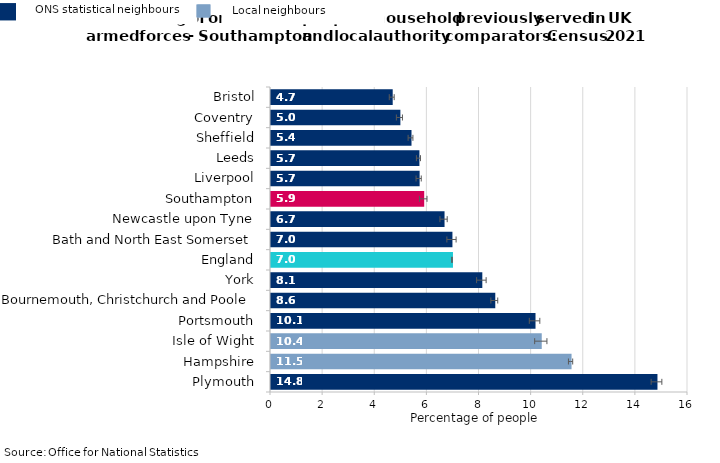
| Category | 1 or more people in the household previously served in UK armed forces |
|---|---|
| Plymouth | 14.828 |
| Hampshire | 11.532 |
| Isle of Wight | 10.388 |
| Portsmouth | 10.149 |
| Bournemouth, Christchurch and Poole | 8.606 |
| York | 8.108 |
| England | 6.982 |
| Bath and North East Somerset | 6.962 |
| Newcastle upon Tyne | 6.659 |
| Southampton | 5.878 |
| Liverpool | 5.703 |
| Leeds | 5.695 |
| Sheffield | 5.391 |
| Coventry | 4.964 |
| Bristol | 4.67 |